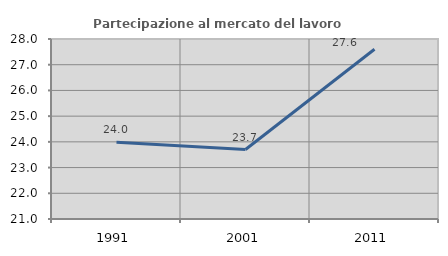
| Category | Partecipazione al mercato del lavoro  femminile |
|---|---|
| 1991.0 | 23.988 |
| 2001.0 | 23.701 |
| 2011.0 | 27.6 |